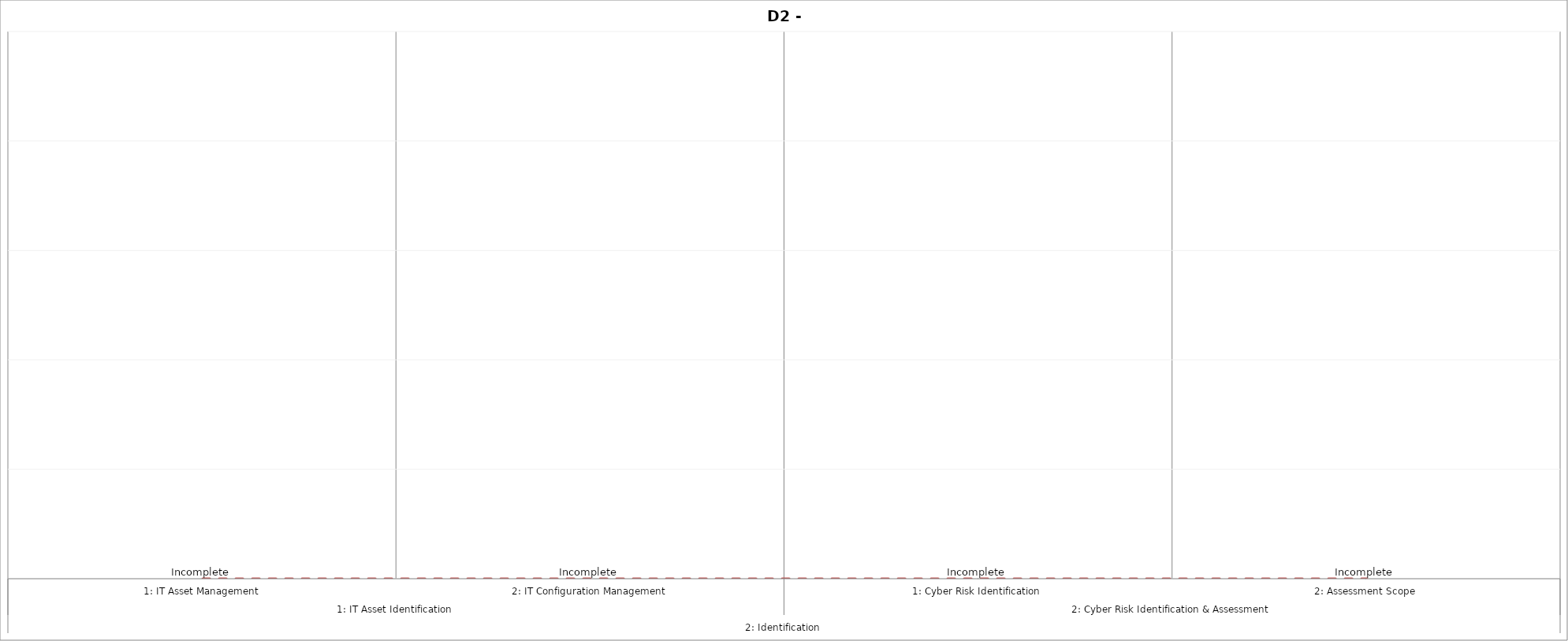
| Category | Component Maturity Level |
|---|---|
| 0 | 0 |
| 1 | 0 |
| 2 | 0 |
| 3 | 0 |